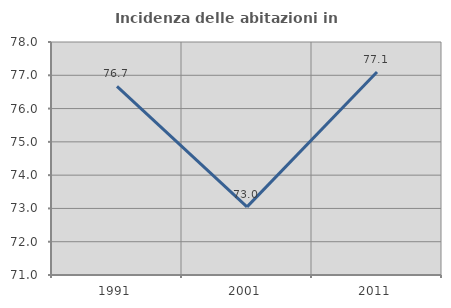
| Category | Incidenza delle abitazioni in proprietà  |
|---|---|
| 1991.0 | 76.667 |
| 2001.0 | 73.048 |
| 2011.0 | 77.099 |